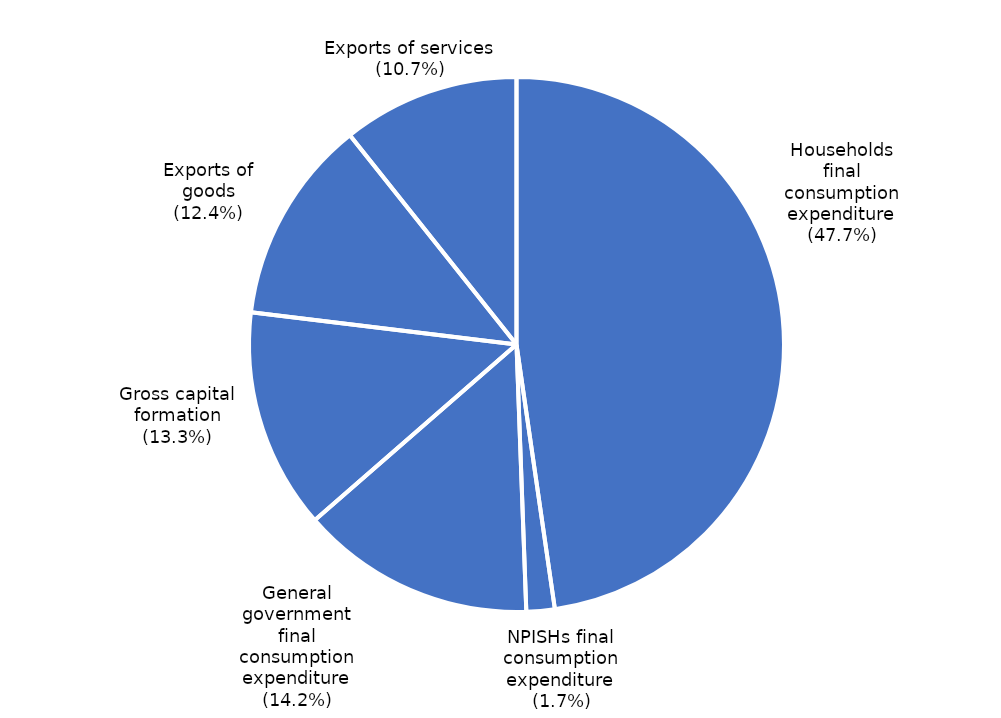
| Category | Series 0 |
|---|---|
| Households
final
consumption
expenditure | 1300305 |
| NPISHs final
consumption
expenditure | 46560 |
| General
government
final
consumption
expenditure | 386667 |
| Gross capital
formation | 363052 |
| Exports of
goods | 337467 |
| Exports of services | 291619 |